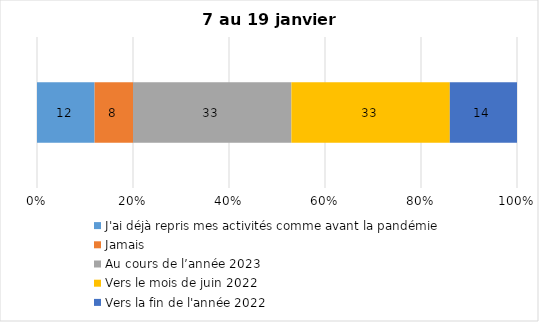
| Category | J'ai déjà repris mes activités comme avant la pandémie | Jamais | Au cours de l’année 2023 | Vers le mois de juin 2022 | Vers la fin de l'année 2022 |
|---|---|---|---|---|---|
| 0 | 12 | 8 | 33 | 33 | 14 |